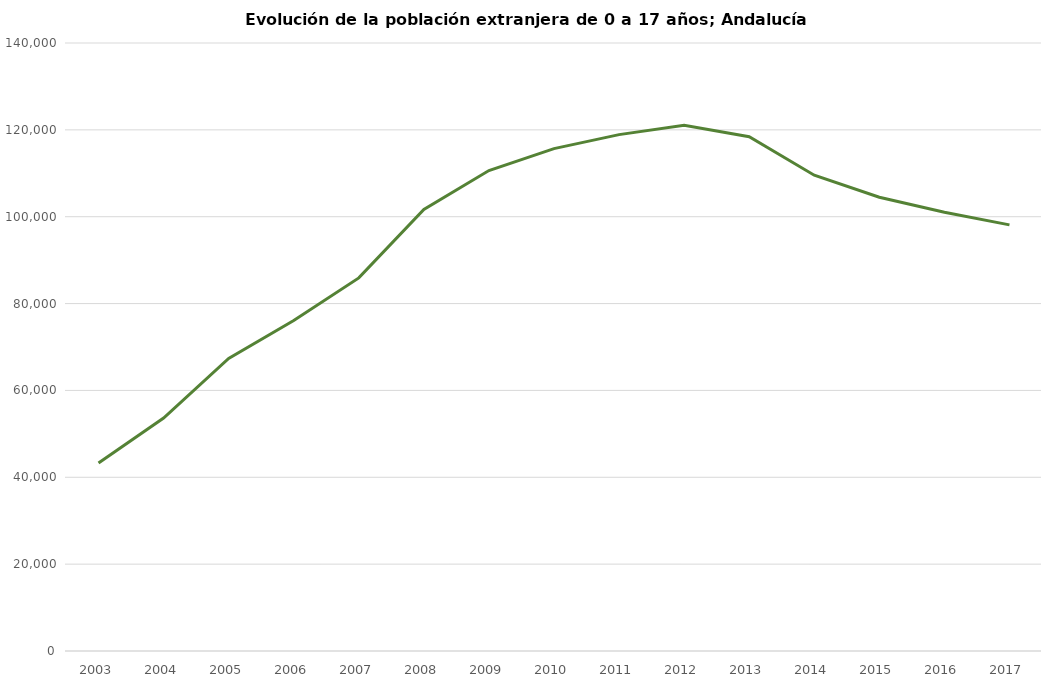
| Category | ANDALUCÍA | Series 1 | Series 2 | Series 3 | Series 4 | Series 5 | Series 6 | Series 7 |
|---|---|---|---|---|---|---|---|---|
| 2003.0 | 43305 |  |  |  |  |  |  |  |
| 2004.0 | 53642 |  |  |  |  |  |  |  |
| 2005.0 | 67353 |  |  |  |  |  |  |  |
| 2006.0 | 76091 |  |  |  |  |  |  |  |
| 2007.0 | 85911 |  |  |  |  |  |  |  |
| 2008.0 | 101664 |  |  |  |  |  |  |  |
| 2009.0 | 110636 |  |  |  |  |  |  |  |
| 2010.0 | 115689 |  |  |  |  |  |  |  |
| 2011.0 | 118906 |  |  |  |  |  |  |  |
| 2012.0 | 121047 |  |  |  |  |  |  |  |
| 2013.0 | 118414 |  |  |  |  |  |  |  |
| 2014.0 | 109558 |  |  |  |  |  |  |  |
| 2015.0 | 104493 |  |  |  |  |  |  |  |
| 2016.0 | 101033 |  |  |  |  |  |  |  |
| 2017.0 | 98116 |  |  |  |  |  |  |  |